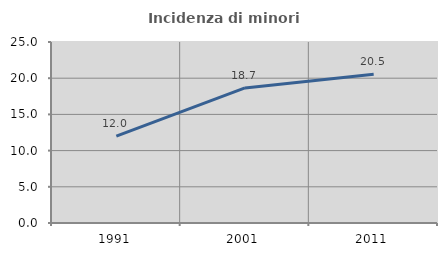
| Category | Incidenza di minori stranieri |
|---|---|
| 1991.0 | 12 |
| 2001.0 | 18.653 |
| 2011.0 | 20.541 |